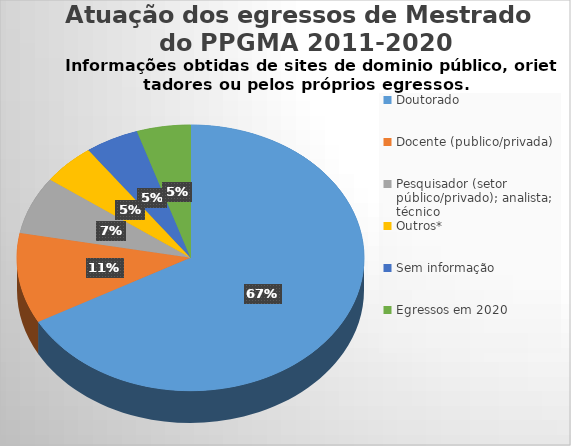
| Category | Series 0 |
|---|---|
| Doutorado | 67 |
| Docente (publico/privada) | 11 |
| Pesquisador (setor público/privado); analista; técnico | 7 |
| Outros* | 5 |
| Sem informação | 5 |
| Egressos em 2020 | 5 |